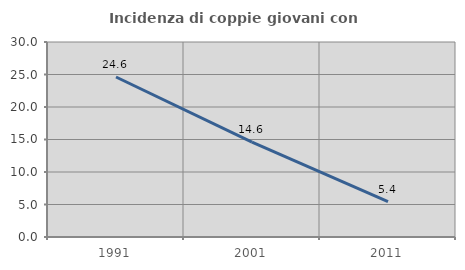
| Category | Incidenza di coppie giovani con figli |
|---|---|
| 1991.0 | 24.615 |
| 2001.0 | 14.599 |
| 2011.0 | 5.426 |